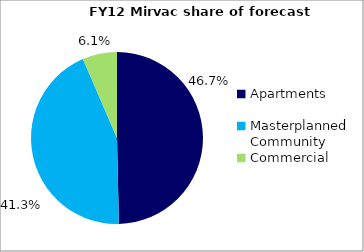
| Category | Series 0 |
|---|---|
| Apartments | 0.467 |
| Masterplanned Community | 0.413 |
| Commercial | 0.061 |